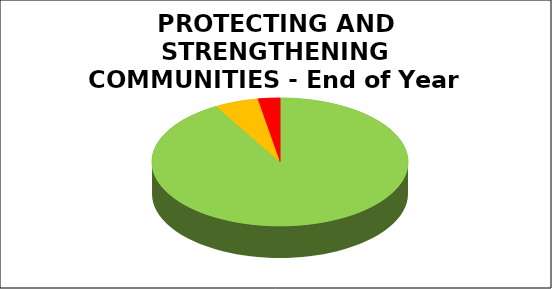
| Category | Series 0 |
|---|---|
| Green | 0.917 |
| Amber | 0.056 |
| Red | 0.028 |